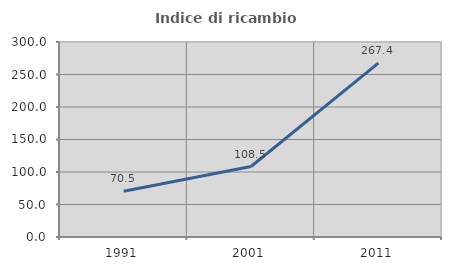
| Category | Indice di ricambio occupazionale  |
|---|---|
| 1991.0 | 70.513 |
| 2001.0 | 108.451 |
| 2011.0 | 267.442 |